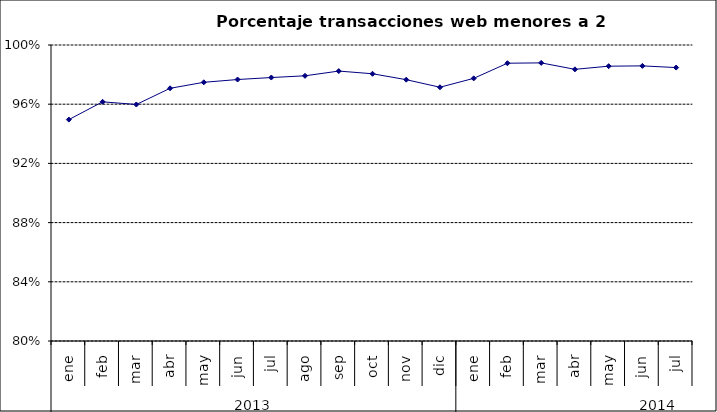
| Category | 94,96% 96,16% 95,98% 97,07% 97,48% 97,67% 97,80% 97,92% 98,24% 98,06% 97,66% 97,15% 97,75% 98,77% 98,79% 98,36% 98,57% 98,59% 98,48% |
|---|---|
| 0 | 0.95 |
| 1 | 0.962 |
| 2 | 0.96 |
| 3 | 0.971 |
| 4 | 0.975 |
| 5 | 0.977 |
| 6 | 0.978 |
| 7 | 0.979 |
| 8 | 0.982 |
| 9 | 0.981 |
| 10 | 0.977 |
| 11 | 0.971 |
| 12 | 0.977 |
| 13 | 0.988 |
| 14 | 0.988 |
| 15 | 0.984 |
| 16 | 0.986 |
| 17 | 0.986 |
| 18 | 0.985 |